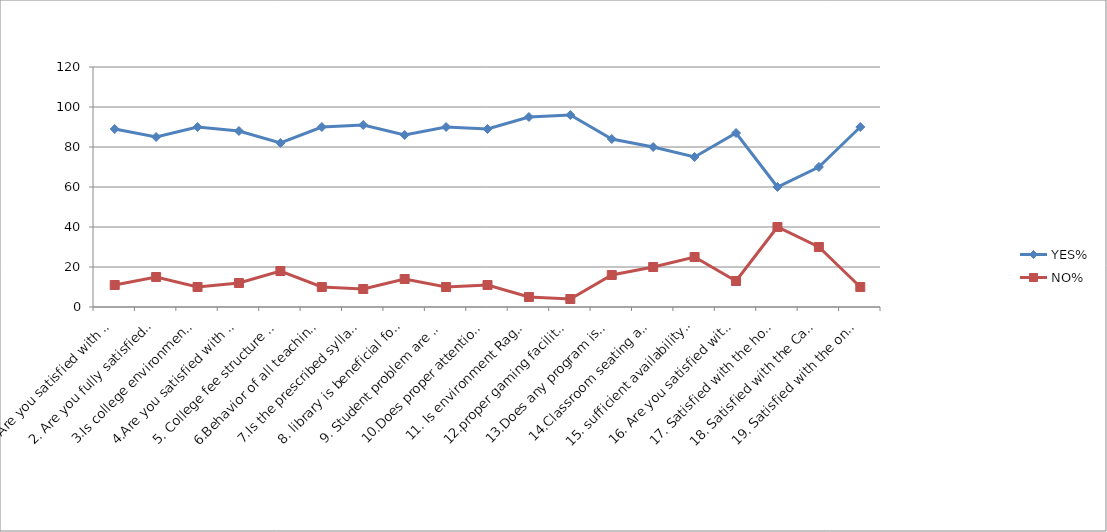
| Category | YES% | NO% |
|---|---|---|
| 1.Are you satisfied with the teaching course work : * | 89 | 11 |
| 2. Are you fully satisfied with extracurricular activities : * | 85 | 15 |
| 3.Is college environment is good: * | 90 | 10 |
| 4.Are you satisfied with discipline system of college : * | 88 | 12 |
| 5. College fee structure is valid in your opinion: * | 82 | 18 |
| 6.Behavior of all teaching staff is fully cooperative: * | 90 | 10 |
| 7.Is the prescribed syllabus taught by in systematic manner: * | 91 | 9 |
| 8. library is beneficial for your ward: * | 86 | 14 |
| 9. Student problem are solved by teachers during teaching /training session: * | 90 | 10 |
| 10.Does proper attention paid by the staff on overall development of student: * | 89 | 11 |
| 11. Is environment Ragging free or not: * | 95 | 5 |
| 12.proper gaming facilities and play ground is available or not: * | 96 | 4 |
| 13.Does any program is going on for self dependency purpose of student; * | 84 | 16 |
| 14.Classroom seating and lighting facilities is sufficient: * | 80 | 20 |
| 15. sufficient availability of Basic amenities: * | 75 | 25 |
| 16. Are you satisfied with the parent-teacher meeting organized by the college : * | 87 | 13 |
| 17. Satisfied with the hostel facility provided by College: * | 60 | 40 |
| 18. Satisfied with the Canteen facility provided by College: * | 70 | 30 |
| 19. Satisfied with the online classes facility provided by College At the time of Covid 19 when the college was not open : * | 90 | 10 |